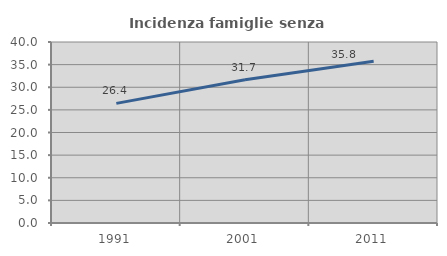
| Category | Incidenza famiglie senza nuclei |
|---|---|
| 1991.0 | 26.437 |
| 2001.0 | 31.675 |
| 2011.0 | 35.763 |